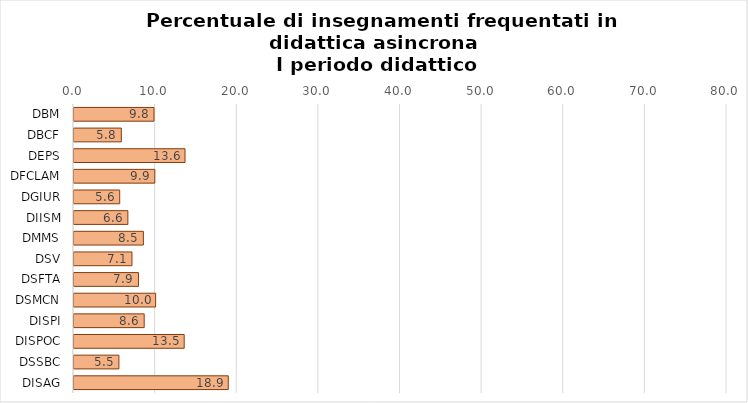
| Category | Series 0 |
|---|---|
| DBM | 9.8 |
| DBCF | 5.8 |
| DEPS | 13.6 |
| DFCLAM | 9.9 |
| DGIUR | 5.6 |
| DIISM | 6.6 |
| DMMS | 8.5 |
| DSV | 7.1 |
| DSFTA | 7.9 |
| DSMCN | 10 |
| DISPI | 8.6 |
| DISPOC | 13.5 |
| DSSBC | 5.5 |
| DISAG | 18.9 |